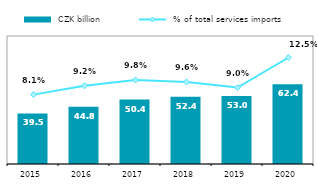
| Category |  CZK billion |
|---|---|
| 2015.0 | 39.517 |
| 2016.0 | 44.807 |
| 2017.0 | 50.389 |
| 2018.0 | 52.446 |
| 2019.0 | 53.04 |
| 2020.0 | 62.374 |